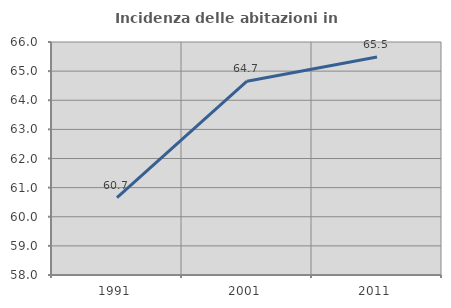
| Category | Incidenza delle abitazioni in proprietà  |
|---|---|
| 1991.0 | 60.654 |
| 2001.0 | 64.653 |
| 2011.0 | 65.483 |